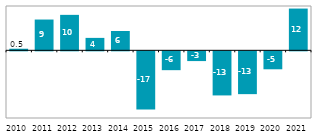
| Category |  mld. Kč |
|---|---|
| 2010 | 0.47 |
| 2011 | 9.099 |
| 2012 | 10.481 |
| 2013 | 3.676 |
| 2014 | 5.713 |
| 2015 | -17.201 |
| 2016 | -5.567 |
| 2017 | -2.881 |
| 2018 | -13.033 |
| 2019 | -12.653 |
| 2020 | -5.307 |
| 2021 | 12.343 |